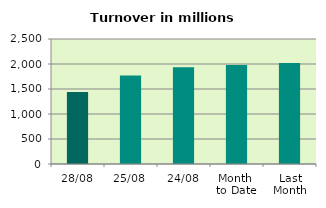
| Category | Series 0 |
|---|---|
| 28/08 | 1438.517 |
| 25/08 | 1771.957 |
| 24/08 | 1936.376 |
| Month 
to Date | 1979.164 |
| Last
Month | 2019.592 |